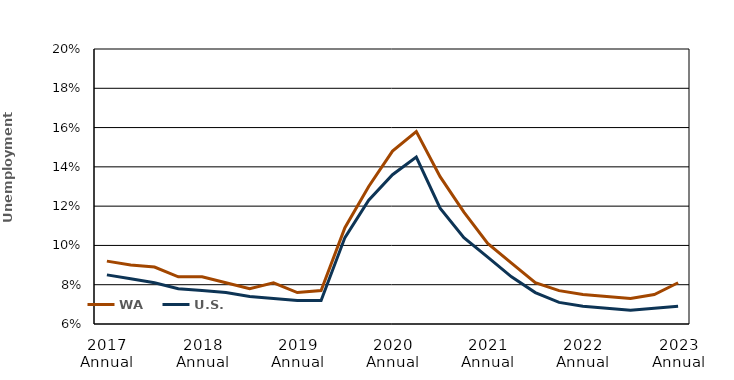
| Category | WA | U.S. |
|---|---|---|
| 2017 Annual | 0.092 | 0.085 |
| 2018 Q1 | 0.09 | 0.083 |
| 2018 Q2 | 0.089 | 0.081 |
| 2018 Q3 | 0.084 | 0.078 |
| 2018 Annual | 0.084 | 0.077 |
| 2019 Q1 | 0.081 | 0.076 |
| 2019 Q2 | 0.078 | 0.074 |
| 2019 Q3 | 0.081 | 0.073 |
| 2019 Annual | 0.076 | 0.072 |
| 2020 Q1 | 0.077 | 0.072 |
| 2020 Q2 | 0.109 | 0.104 |
| 2020 Q3 | 0.13 | 0.123 |
| 2020 Annual | 0.148 | 0.136 |
| 2021 Q1 | 0.158 | 0.145 |
| 2021 Q2 | 0.135 | 0.119 |
| 2021 Q3 | 0.117 | 0.104 |
| 2021 Annual | 0.101 | 0.094 |
| 2022 Q1 | 0.091 | 0.084 |
| 2022 Q2 | 0.081 | 0.076 |
| 2022 Q3 | 0.077 | 0.071 |
| 2022 Annual | 0.075 | 0.069 |
| 2023 Q1 | 0.074 | 0.068 |
| 2023 Q2 | 0.073 | 0.067 |
| 2023 Q3 | 0.075 | 0.068 |
| 2023 Annual | 0.081 | 0.069 |